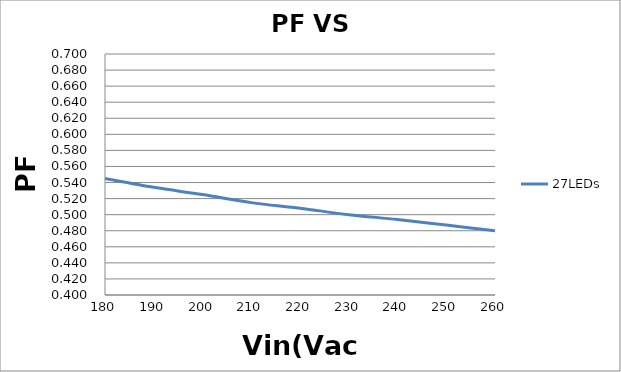
| Category | 27LEDs |
|---|---|
| 180.0 | 0.545 |
| 190.0 | 0.534 |
| 200.0 | 0.525 |
| 210.0 | 0.515 |
| 220.0 | 0.508 |
| 230.0 | 0.5 |
| 240.0 | 0.494 |
| 250.0 | 0.487 |
| 260.0 | 0.48 |